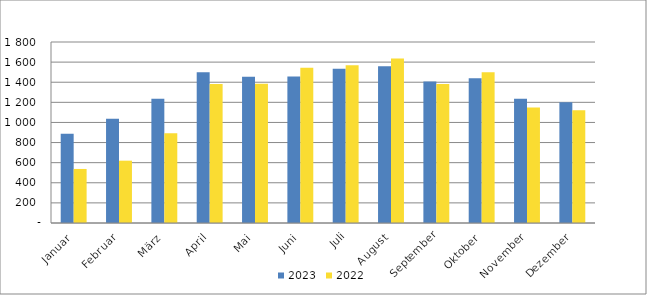
| Category | 2023 | 2022 |
|---|---|---|
| Januar | 887285 | 537356 |
| Februar | 1035993 | 619781 |
| März | 1236687 | 891935 |
| April | 1499201 | 1382714 |
| Mai | 1454720 | 1383660 |
| Juni | 1456610 | 1542845 |
| Juli | 1534076 | 1568342 |
| August | 1557968 | 1634848 |
| September | 1406361 | 1382037 |
| Oktober | 1439361 | 1498661 |
| November | 1234624 | 1147579 |
| Dezember | 1199694 | 1121309 |